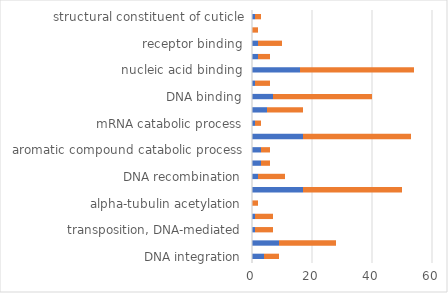
| Category | up-regulated | down-regulated |
|---|---|---|
| DNA integration | 4 | 5 |
| DNA metabolic process | 9 | 19 |
| transposition, DNA-mediated | 1 | 6 |
| transposition | 1 | 6 |
| alpha-tubulin acetylation | 0 | 2 |
| nucleic acid metabolic process | 17 | 33 |
| DNA recombination | 2 | 9 |
| organic cyclic compound catabolic process | 3 | 3 |
| aromatic compound catabolic process | 3 | 3 |
| nucleobase-containing compound metabolic process | 17 | 36 |
| mRNA catabolic process | 1 | 2 |
| protein dimerization activity | 5 | 12 |
| DNA binding | 7 | 33 |
| transposase activity | 1 | 5 |
| nucleic acid binding | 16 | 38 |
| hormone activity | 2 | 4 |
| receptor binding | 2 | 8 |
| tubulin N-acetyltransferase activity | 0 | 2 |
| structural constituent of cuticle | 1 | 2 |